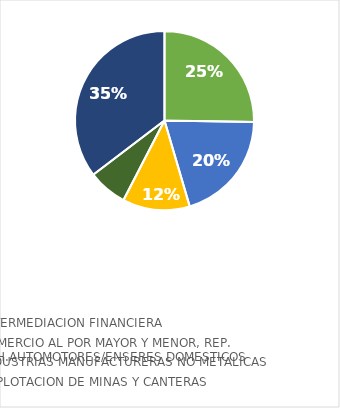
| Category | Series 0 |
|---|---|
| INTERMEDIACION FINANCIERA | 0.25 |
| COMERCIO AL POR MAYOR Y MENOR, REP. VEH.AUTOMOTORES/ENSERES DOMESTICOS | 0.2 |
| INDUSTRIAS MANUFACTURERAS NO METALICAS | 0.12 |
| EXPLOTACION DE MINAS Y CANTERAS | 0.07 |
| OTROS RUBROS | 0.35 |